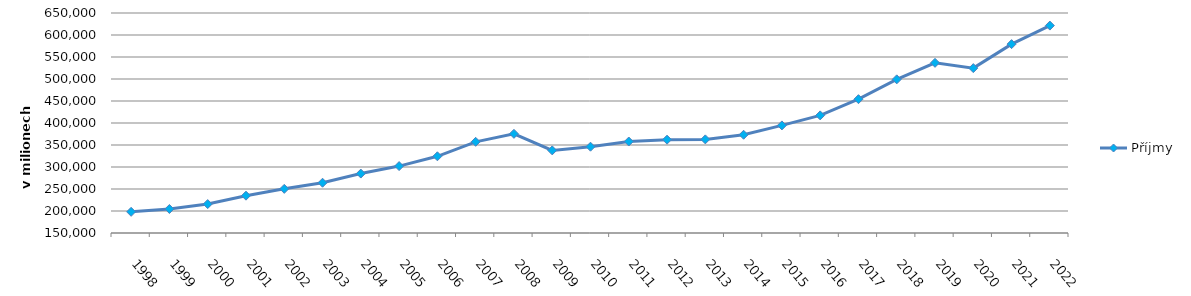
| Category | Příjmy |
|---|---|
| 1998.0 | 198130 |
| 1999.0 | 204553 |
| 2000.0 | 215714 |
| 2001.0 | 234814.549 |
| 2002.0 | 250348.776 |
| 2003.0 | 264208 |
| 2004.0 | 285063.585 |
| 2005.0 | 302085.434 |
| 2006.0 | 324349.868 |
| 2007.0 | 357209.569 |
| 2008.0 | 375367.744 |
| 2009.0 | 337757.504 |
| 2010.0 | 346101.251 |
| 2011.0 | 357918.769 |
| 2012.0 | 362096.736 |
| 2013.0 | 362757.729 |
| 2014.0 | 373273.424 |
| 2015.0 | 394506.653 |
| 2016.0 | 417316.13 |
| 2017.0 | 454140.097 |
| 2018.0 | 499185.346 |
| 2019.0 | 536721.843 |
| 2020.0 | 524738.898 |
| 2021.0 | 579232.592 |
| 2022.0 | 621393.38 |